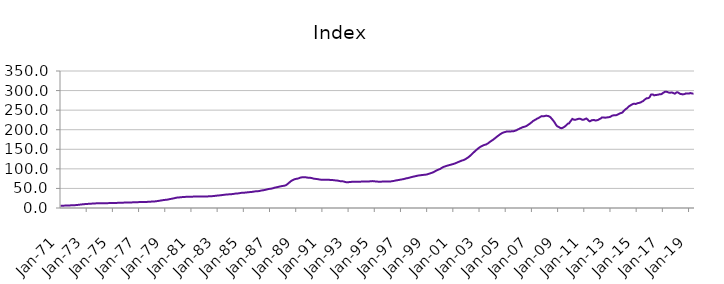
| Category | Index |
|---|---|
| 1971-01-01 | 5.879 |
| 1971-02-01 | 5.921 |
| 1971-03-01 | 5.963 |
| 1971-04-01 | 6.018 |
| 1971-05-01 | 6.108 |
| 1971-06-01 | 6.203 |
| 1971-07-01 | 6.32 |
| 1971-08-01 | 6.446 |
| 1971-09-01 | 6.572 |
| 1971-10-01 | 6.703 |
| 1971-11-01 | 6.844 |
| 1971-12-01 | 7.015 |
| 1972-01-01 | 7.135 |
| 1972-02-01 | 7.213 |
| 1972-03-01 | 7.39 |
| 1972-04-01 | 7.638 |
| 1972-05-01 | 7.997 |
| 1972-06-01 | 8.312 |
| 1972-07-01 | 8.674 |
| 1972-08-01 | 9.023 |
| 1972-09-01 | 9.332 |
| 1972-10-01 | 9.62 |
| 1972-11-01 | 9.887 |
| 1972-12-01 | 10.162 |
| 1973-01-01 | 10.359 |
| 1973-02-01 | 10.498 |
| 1973-03-01 | 10.658 |
| 1973-04-01 | 10.841 |
| 1973-05-01 | 11.075 |
| 1973-06-01 | 11.227 |
| 1973-07-01 | 11.386 |
| 1973-08-01 | 11.562 |
| 1973-09-01 | 11.768 |
| 1973-10-01 | 11.982 |
| 1973-11-01 | 12.145 |
| 1973-12-01 | 12.262 |
| 1974-01-01 | 12.324 |
| 1974-02-01 | 12.392 |
| 1974-03-01 | 12.389 |
| 1974-04-01 | 12.362 |
| 1974-05-01 | 12.339 |
| 1974-06-01 | 12.34 |
| 1974-07-01 | 12.352 |
| 1974-08-01 | 12.392 |
| 1974-09-01 | 12.465 |
| 1974-10-01 | 12.555 |
| 1974-11-01 | 12.63 |
| 1974-12-01 | 12.703 |
| 1975-01-01 | 12.737 |
| 1975-02-01 | 12.78 |
| 1975-03-01 | 12.857 |
| 1975-04-01 | 12.965 |
| 1975-05-01 | 13.097 |
| 1975-06-01 | 13.168 |
| 1975-07-01 | 13.237 |
| 1975-08-01 | 13.332 |
| 1975-09-01 | 13.462 |
| 1975-10-01 | 13.606 |
| 1975-11-01 | 13.732 |
| 1975-12-01 | 13.867 |
| 1976-01-01 | 13.963 |
| 1976-02-01 | 14.052 |
| 1976-03-01 | 14.114 |
| 1976-04-01 | 14.179 |
| 1976-05-01 | 14.264 |
| 1976-06-01 | 14.32 |
| 1976-07-01 | 14.382 |
| 1976-08-01 | 14.474 |
| 1976-09-01 | 14.605 |
| 1976-10-01 | 14.752 |
| 1976-11-01 | 14.87 |
| 1976-12-01 | 14.976 |
| 1977-01-01 | 15.034 |
| 1977-02-01 | 15.102 |
| 1977-03-01 | 15.145 |
| 1977-04-01 | 15.197 |
| 1977-05-01 | 15.276 |
| 1977-06-01 | 15.347 |
| 1977-07-01 | 15.436 |
| 1977-08-01 | 15.557 |
| 1977-09-01 | 15.705 |
| 1977-10-01 | 15.871 |
| 1977-11-01 | 16.048 |
| 1977-12-01 | 16.278 |
| 1978-01-01 | 16.449 |
| 1978-02-01 | 16.582 |
| 1978-03-01 | 16.762 |
| 1978-04-01 | 17.003 |
| 1978-05-01 | 17.391 |
| 1978-06-01 | 17.783 |
| 1978-07-01 | 18.258 |
| 1978-08-01 | 18.744 |
| 1978-09-01 | 19.213 |
| 1978-10-01 | 19.678 |
| 1978-11-01 | 20.113 |
| 1978-12-01 | 20.542 |
| 1979-01-01 | 20.797 |
| 1979-02-01 | 20.968 |
| 1979-03-01 | 21.394 |
| 1979-04-01 | 21.979 |
| 1979-05-01 | 22.725 |
| 1979-06-01 | 23.198 |
| 1979-07-01 | 23.69 |
| 1979-08-01 | 24.243 |
| 1979-09-01 | 24.906 |
| 1979-10-01 | 25.613 |
| 1979-11-01 | 26.202 |
| 1979-12-01 | 26.66 |
| 1980-01-01 | 26.911 |
| 1980-02-01 | 27.107 |
| 1980-03-01 | 27.357 |
| 1980-04-01 | 27.651 |
| 1980-05-01 | 27.994 |
| 1980-06-01 | 28.178 |
| 1980-07-01 | 28.344 |
| 1980-08-01 | 28.498 |
| 1980-09-01 | 28.607 |
| 1980-10-01 | 28.676 |
| 1980-11-01 | 28.73 |
| 1980-12-01 | 28.843 |
| 1981-01-01 | 28.911 |
| 1981-02-01 | 29.013 |
| 1981-03-01 | 29.116 |
| 1981-04-01 | 29.254 |
| 1981-05-01 | 29.394 |
| 1981-06-01 | 29.441 |
| 1981-07-01 | 29.464 |
| 1981-08-01 | 29.469 |
| 1981-09-01 | 29.414 |
| 1981-10-01 | 29.312 |
| 1981-11-01 | 29.219 |
| 1981-12-01 | 29.209 |
| 1982-01-01 | 29.164 |
| 1982-02-01 | 29.184 |
| 1982-03-01 | 29.346 |
| 1982-04-01 | 29.618 |
| 1982-05-01 | 29.924 |
| 1982-06-01 | 30.035 |
| 1982-07-01 | 30.119 |
| 1982-08-01 | 30.28 |
| 1982-09-01 | 30.54 |
| 1982-10-01 | 30.849 |
| 1982-11-01 | 31.157 |
| 1982-12-01 | 31.538 |
| 1983-01-01 | 31.828 |
| 1983-02-01 | 32.078 |
| 1983-03-01 | 32.337 |
| 1983-04-01 | 32.659 |
| 1983-05-01 | 33.081 |
| 1983-06-01 | 33.413 |
| 1983-07-01 | 33.773 |
| 1983-08-01 | 34.116 |
| 1983-09-01 | 34.39 |
| 1983-10-01 | 34.614 |
| 1983-11-01 | 34.826 |
| 1983-12-01 | 35.104 |
| 1984-01-01 | 35.27 |
| 1984-02-01 | 35.438 |
| 1984-03-01 | 35.758 |
| 1984-04-01 | 36.202 |
| 1984-05-01 | 36.71 |
| 1984-06-01 | 36.936 |
| 1984-07-01 | 37.124 |
| 1984-08-01 | 37.411 |
| 1984-09-01 | 37.87 |
| 1984-10-01 | 38.4 |
| 1984-11-01 | 38.81 |
| 1984-12-01 | 39.095 |
| 1985-01-01 | 39.174 |
| 1985-02-01 | 39.283 |
| 1985-03-01 | 39.552 |
| 1985-04-01 | 39.93 |
| 1985-05-01 | 40.361 |
| 1985-06-01 | 40.527 |
| 1985-07-01 | 40.681 |
| 1985-08-01 | 40.948 |
| 1985-09-01 | 41.393 |
| 1985-10-01 | 41.902 |
| 1985-11-01 | 42.329 |
| 1985-12-01 | 42.671 |
| 1986-01-01 | 42.803 |
| 1986-02-01 | 42.939 |
| 1986-03-01 | 43.335 |
| 1986-04-01 | 43.908 |
| 1986-05-01 | 44.624 |
| 1986-06-01 | 45.057 |
| 1986-07-01 | 45.499 |
| 1986-08-01 | 46.028 |
| 1986-09-01 | 46.692 |
| 1986-10-01 | 47.409 |
| 1986-11-01 | 48.06 |
| 1986-12-01 | 48.667 |
| 1987-01-01 | 49.02 |
| 1987-02-01 | 49.311 |
| 1987-03-01 | 49.944 |
| 1987-04-01 | 50.795 |
| 1987-05-01 | 51.813 |
| 1987-06-01 | 52.387 |
| 1987-07-01 | 52.937 |
| 1987-08-01 | 53.541 |
| 1987-09-01 | 54.197 |
| 1987-10-01 | 54.877 |
| 1987-11-01 | 55.513 |
| 1987-12-01 | 56.172 |
| 1988-01-01 | 56.486 |
| 1988-02-01 | 56.756 |
| 1988-03-01 | 57.701 |
| 1988-04-01 | 59.124 |
| 1988-05-01 | 61.264 |
| 1988-06-01 | 63.424 |
| 1988-07-01 | 65.968 |
| 1988-08-01 | 68.307 |
| 1988-09-01 | 70.109 |
| 1988-10-01 | 71.604 |
| 1988-11-01 | 72.807 |
| 1988-12-01 | 73.875 |
| 1989-01-01 | 74.434 |
| 1989-02-01 | 74.906 |
| 1989-03-01 | 75.707 |
| 1989-04-01 | 76.727 |
| 1989-05-01 | 77.807 |
| 1989-06-01 | 78.279 |
| 1989-07-01 | 78.601 |
| 1989-08-01 | 78.752 |
| 1989-09-01 | 78.622 |
| 1989-10-01 | 78.258 |
| 1989-11-01 | 77.774 |
| 1989-12-01 | 77.38 |
| 1990-01-01 | 77.025 |
| 1990-02-01 | 77.011 |
| 1990-03-01 | 76.482 |
| 1990-04-01 | 75.796 |
| 1990-05-01 | 74.994 |
| 1990-06-01 | 74.611 |
| 1990-07-01 | 74.285 |
| 1990-08-01 | 73.967 |
| 1990-09-01 | 73.52 |
| 1990-10-01 | 73.009 |
| 1990-11-01 | 72.535 |
| 1990-12-01 | 72.334 |
| 1991-01-01 | 72.192 |
| 1991-02-01 | 72.268 |
| 1991-03-01 | 72.153 |
| 1991-04-01 | 72.077 |
| 1991-05-01 | 71.977 |
| 1991-06-01 | 71.933 |
| 1991-07-01 | 71.885 |
| 1991-08-01 | 71.819 |
| 1991-09-01 | 71.705 |
| 1991-10-01 | 71.501 |
| 1991-11-01 | 71.166 |
| 1991-12-01 | 70.813 |
| 1992-01-01 | 70.463 |
| 1992-02-01 | 70.409 |
| 1992-03-01 | 69.918 |
| 1992-04-01 | 69.325 |
| 1992-05-01 | 68.671 |
| 1992-06-01 | 68.457 |
| 1992-07-01 | 68.303 |
| 1992-08-01 | 67.98 |
| 1992-09-01 | 67.29 |
| 1992-10-01 | 66.434 |
| 1992-11-01 | 65.854 |
| 1992-12-01 | 65.871 |
| 1993-01-01 | 66.034 |
| 1993-02-01 | 66.322 |
| 1993-03-01 | 66.581 |
| 1993-04-01 | 66.905 |
| 1993-05-01 | 67.182 |
| 1993-06-01 | 67.213 |
| 1993-07-01 | 67.233 |
| 1993-08-01 | 67.289 |
| 1993-09-01 | 67.247 |
| 1993-10-01 | 67.126 |
| 1993-11-01 | 67.046 |
| 1993-12-01 | 67.281 |
| 1994-01-01 | 67.604 |
| 1994-02-01 | 68.006 |
| 1994-03-01 | 67.991 |
| 1994-04-01 | 67.827 |
| 1994-05-01 | 67.683 |
| 1994-06-01 | 67.696 |
| 1994-07-01 | 67.777 |
| 1994-08-01 | 67.944 |
| 1994-09-01 | 68.21 |
| 1994-10-01 | 68.532 |
| 1994-11-01 | 68.685 |
| 1994-12-01 | 68.595 |
| 1995-01-01 | 68.092 |
| 1995-02-01 | 67.66 |
| 1995-03-01 | 67.497 |
| 1995-04-01 | 67.327 |
| 1995-05-01 | 67.356 |
| 1995-06-01 | 67.213 |
| 1995-07-01 | 67.36 |
| 1995-08-01 | 67.425 |
| 1995-09-01 | 67.463 |
| 1995-10-01 | 67.439 |
| 1995-11-01 | 67.524 |
| 1995-12-01 | 67.607 |
| 1996-01-01 | 67.632 |
| 1996-02-01 | 67.59 |
| 1996-03-01 | 67.814 |
| 1996-04-01 | 68.077 |
| 1996-05-01 | 68.578 |
| 1996-06-01 | 68.945 |
| 1996-07-01 | 69.543 |
| 1996-08-01 | 70.122 |
| 1996-09-01 | 70.708 |
| 1996-10-01 | 71.134 |
| 1996-11-01 | 71.585 |
| 1996-12-01 | 72.224 |
| 1997-01-01 | 72.682 |
| 1997-02-01 | 73.17 |
| 1997-03-01 | 73.587 |
| 1997-04-01 | 74.264 |
| 1997-05-01 | 75.148 |
| 1997-06-01 | 75.819 |
| 1997-07-01 | 76.292 |
| 1997-08-01 | 77.048 |
| 1997-09-01 | 77.723 |
| 1997-10-01 | 78.598 |
| 1997-11-01 | 79.21 |
| 1997-12-01 | 79.988 |
| 1998-01-01 | 80.449 |
| 1998-02-01 | 81.141 |
| 1998-03-01 | 81.745 |
| 1998-04-01 | 82.495 |
| 1998-05-01 | 83.027 |
| 1998-06-01 | 83.355 |
| 1998-07-01 | 83.747 |
| 1998-08-01 | 84.113 |
| 1998-09-01 | 84.484 |
| 1998-10-01 | 84.731 |
| 1998-11-01 | 85.018 |
| 1998-12-01 | 85.363 |
| 1999-01-01 | 85.875 |
| 1999-02-01 | 86.896 |
| 1999-03-01 | 87.796 |
| 1999-04-01 | 88.688 |
| 1999-05-01 | 89.666 |
| 1999-06-01 | 90.701 |
| 1999-07-01 | 91.918 |
| 1999-08-01 | 93.495 |
| 1999-09-01 | 95.101 |
| 1999-10-01 | 96.577 |
| 1999-11-01 | 97.58 |
| 1999-12-01 | 98.926 |
| 2000-01-01 | 100 |
| 2000-02-01 | 101.936 |
| 2000-03-01 | 103.455 |
| 2000-04-01 | 105.075 |
| 2000-05-01 | 105.895 |
| 2000-06-01 | 106.901 |
| 2000-07-01 | 107.798 |
| 2000-08-01 | 108.633 |
| 2000-09-01 | 109.409 |
| 2000-10-01 | 110.207 |
| 2000-11-01 | 110.863 |
| 2000-12-01 | 111.699 |
| 2001-01-01 | 112.376 |
| 2001-02-01 | 113.427 |
| 2001-03-01 | 114.41 |
| 2001-04-01 | 115.617 |
| 2001-05-01 | 116.92 |
| 2001-06-01 | 118 |
| 2001-07-01 | 119.178 |
| 2001-08-01 | 120.352 |
| 2001-09-01 | 121.415 |
| 2001-10-01 | 122.129 |
| 2001-11-01 | 123.346 |
| 2001-12-01 | 124.695 |
| 2002-01-01 | 126.498 |
| 2002-02-01 | 128.249 |
| 2002-03-01 | 130.341 |
| 2002-04-01 | 132.594 |
| 2002-05-01 | 135.137 |
| 2002-06-01 | 137.714 |
| 2002-07-01 | 140.534 |
| 2002-08-01 | 143.04 |
| 2002-09-01 | 145.7 |
| 2002-10-01 | 148.191 |
| 2002-11-01 | 150.379 |
| 2002-12-01 | 152.788 |
| 2003-01-01 | 154.938 |
| 2003-02-01 | 156.702 |
| 2003-03-01 | 158.127 |
| 2003-04-01 | 159.492 |
| 2003-05-01 | 160.649 |
| 2003-06-01 | 161.58 |
| 2003-07-01 | 162.401 |
| 2003-08-01 | 164.014 |
| 2003-09-01 | 165.699 |
| 2003-10-01 | 167.901 |
| 2003-11-01 | 170.039 |
| 2003-12-01 | 171.829 |
| 2004-01-01 | 173.609 |
| 2004-02-01 | 175.589 |
| 2004-03-01 | 177.991 |
| 2004-04-01 | 180.138 |
| 2004-05-01 | 182.465 |
| 2004-06-01 | 184.54 |
| 2004-07-01 | 186.551 |
| 2004-08-01 | 188.625 |
| 2004-09-01 | 190.257 |
| 2004-10-01 | 192.019 |
| 2004-11-01 | 192.962 |
| 2004-12-01 | 193.904 |
| 2005-01-01 | 194.627 |
| 2005-02-01 | 195.72 |
| 2005-03-01 | 195.655 |
| 2005-04-01 | 195.754 |
| 2005-05-01 | 195.194 |
| 2005-06-01 | 195.793 |
| 2005-07-01 | 195.867 |
| 2005-08-01 | 196.175 |
| 2005-09-01 | 196.736 |
| 2005-10-01 | 197.938 |
| 2005-11-01 | 198.884 |
| 2005-12-01 | 200.645 |
| 2006-01-01 | 201.661 |
| 2006-02-01 | 203.374 |
| 2006-03-01 | 204.511 |
| 2006-04-01 | 205.861 |
| 2006-05-01 | 206.826 |
| 2006-06-01 | 207.511 |
| 2006-07-01 | 208.388 |
| 2006-08-01 | 209.567 |
| 2006-09-01 | 211.353 |
| 2006-10-01 | 213.443 |
| 2006-11-01 | 215.14 |
| 2006-12-01 | 217.475 |
| 2007-01-01 | 219.496 |
| 2007-02-01 | 222.231 |
| 2007-03-01 | 223.7 |
| 2007-04-01 | 225.58 |
| 2007-05-01 | 226.869 |
| 2007-06-01 | 228.812 |
| 2007-07-01 | 229.701 |
| 2007-08-01 | 231.63 |
| 2007-09-01 | 233.384 |
| 2007-10-01 | 234.664 |
| 2007-11-01 | 234.312 |
| 2007-12-01 | 234.555 |
| 2008-01-01 | 235.086 |
| 2008-02-01 | 236.026 |
| 2008-03-01 | 235.364 |
| 2008-04-01 | 234.965 |
| 2008-05-01 | 233.6 |
| 2008-06-01 | 231.702 |
| 2008-07-01 | 228.29 |
| 2008-08-01 | 225.152 |
| 2008-09-01 | 221.485 |
| 2008-10-01 | 217.485 |
| 2008-11-01 | 212.758 |
| 2008-12-01 | 209.323 |
| 2009-01-01 | 207.652 |
| 2009-02-01 | 206.212 |
| 2009-03-01 | 204.576 |
| 2009-04-01 | 203.86 |
| 2009-05-01 | 204.572 |
| 2009-06-01 | 206.247 |
| 2009-07-01 | 207.906 |
| 2009-08-01 | 210.209 |
| 2009-09-01 | 213.072 |
| 2009-10-01 | 215.548 |
| 2009-11-01 | 216.169 |
| 2009-12-01 | 220.435 |
| 2010-01-01 | 223.882 |
| 2010-02-01 | 227.544 |
| 2010-03-01 | 226.207 |
| 2010-04-01 | 225.371 |
| 2010-05-01 | 225.616 |
| 2010-06-01 | 226.496 |
| 2010-07-01 | 227.242 |
| 2010-08-01 | 228.031 |
| 2010-09-01 | 227.934 |
| 2010-10-01 | 227.086 |
| 2010-11-01 | 225.565 |
| 2010-12-01 | 225.597 |
| 2011-01-01 | 226.214 |
| 2011-02-01 | 228.039 |
| 2011-03-01 | 228.503 |
| 2011-04-01 | 226.162 |
| 2011-05-01 | 223.102 |
| 2011-06-01 | 221.419 |
| 2011-07-01 | 222.781 |
| 2011-08-01 | 224.513 |
| 2011-09-01 | 224.472 |
| 2011-10-01 | 224.841 |
| 2011-11-01 | 223.579 |
| 2011-12-01 | 223.822 |
| 2012-01-01 | 224.584 |
| 2012-02-01 | 225.473 |
| 2012-03-01 | 227.466 |
| 2012-04-01 | 228.575 |
| 2012-05-01 | 231.11 |
| 2012-06-01 | 231.251 |
| 2012-07-01 | 231.282 |
| 2012-08-01 | 230.612 |
| 2012-09-01 | 231.126 |
| 2012-10-01 | 231.503 |
| 2012-11-01 | 231.747 |
| 2012-12-01 | 232.346 |
| 2013-01-01 | 233.26 |
| 2013-02-01 | 235.199 |
| 2013-03-01 | 236.287 |
| 2013-04-01 | 236.897 |
| 2013-05-01 | 236.822 |
| 2013-06-01 | 237.016 |
| 2013-07-01 | 237.888 |
| 2013-08-01 | 239.493 |
| 2013-09-01 | 240.786 |
| 2013-10-01 | 242.115 |
| 2013-11-01 | 242.898 |
| 2013-12-01 | 244.057 |
| 2014-01-01 | 247.816 |
| 2014-02-01 | 250.169 |
| 2014-03-01 | 252.769 |
| 2014-04-01 | 254.326 |
| 2014-05-01 | 257.246 |
| 2014-06-01 | 260.069 |
| 2014-07-01 | 261.53 |
| 2014-08-01 | 263.472 |
| 2014-09-01 | 264.905 |
| 2014-10-01 | 266.07 |
| 2014-11-01 | 266.347 |
| 2014-12-01 | 265.659 |
| 2015-01-01 | 266.928 |
| 2015-02-01 | 267.88 |
| 2015-03-01 | 268.307 |
| 2015-04-01 | 269.155 |
| 2015-05-01 | 270.34 |
| 2015-06-01 | 272.163 |
| 2015-07-01 | 273.277 |
| 2015-08-01 | 276.288 |
| 2015-09-01 | 278.116 |
| 2015-10-01 | 280.486 |
| 2015-11-01 | 280.294 |
| 2015-12-01 | 281.199 |
| 2016-01-01 | 283.607 |
| 2016-02-01 | 289.619 |
| 2016-03-01 | 290.057 |
| 2016-04-01 | 289.886 |
| 2016-05-01 | 287.681 |
| 2016-06-01 | 288.483 |
| 2016-07-01 | 288.661 |
| 2016-08-01 | 289.259 |
| 2016-09-01 | 289.711 |
| 2016-10-01 | 290.701 |
| 2016-11-01 | 290.463 |
| 2016-12-01 | 291.375 |
| 2017-01-01 | 293.717 |
| 2017-02-01 | 295.456 |
| 2017-03-01 | 297.078 |
| 2017-04-01 | 296.912 |
| 2017-05-01 | 296.553 |
| 2017-06-01 | 295.078 |
| 2017-07-01 | 294.677 |
| 2017-08-01 | 294.669 |
| 2017-09-01 | 295.305 |
| 2017-10-01 | 294.345 |
| 2017-11-01 | 293.162 |
| 2017-12-01 | 292.069 |
| 2018-01-01 | 294.449 |
| 2018-02-01 | 295.846 |
| 2018-03-01 | 294.92 |
| 2018-04-01 | 292.924 |
| 2018-05-01 | 291.472 |
| 2018-06-01 | 291.002 |
| 2018-07-01 | 290.236 |
| 2018-08-01 | 290.758 |
| 2018-09-01 | 291.058 |
| 2018-10-01 | 292.824 |
| 2018-11-01 | 292.65 |
| 2018-12-01 | 292.367 |
| 2019-01-01 | 292.359 |
| 2019-02-01 | 293.758 |
| 2019-03-01 | 293.064 |
| 2019-04-01 | 292.324 |
| 2019-05-01 | 292.13 |